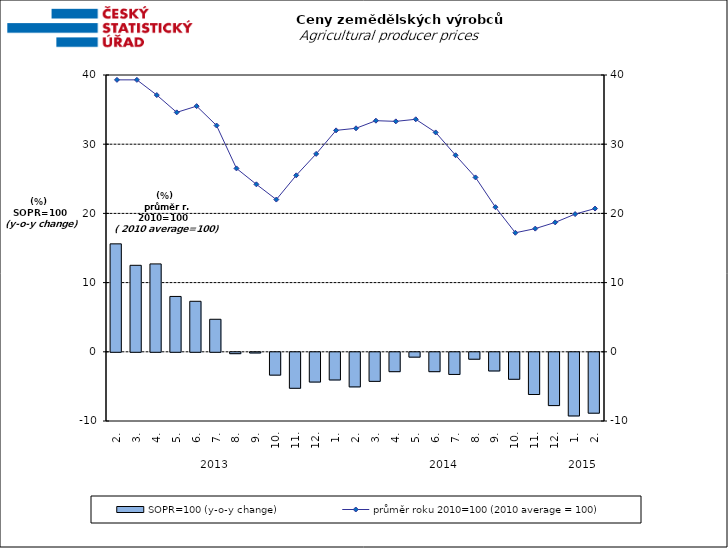
| Category | SOPR=100 (y-o-y change)   |
|---|---|
| 0 | 15.6 |
| 1 | 12.5 |
| 2 | 12.7 |
| 3 | 8 |
| 4 | 7.3 |
| 5 | 4.7 |
| 6 | -0.2 |
| 7 | -0.1 |
| 8 | -3.3 |
| 9 | -5.2 |
| 10 | -4.3 |
| 11 | -4 |
| 12 | -5 |
| 13 | -4.2 |
| 14 | -2.8 |
| 15 | -0.7 |
| 16 | -2.8 |
| 17 | -3.2 |
| 18 | -1 |
| 19 | -2.7 |
| 20 | -3.9 |
| 21 | -6.1 |
| 22 | -7.7 |
| 23 | -9.2 |
| 24 | -8.8 |